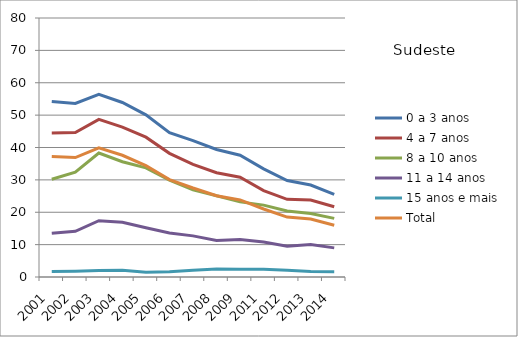
| Category | 0 a 3 anos | 4 a 7 anos | 8 a 10 anos | 11 a 14 anos | 15 anos e mais | Total |
|---|---|---|---|---|---|---|
| 2001.0 | 54.2 | 44.5 | 30.2 | 13.5 | 1.7 | 37.2 |
| 2002.0 | 53.6 | 44.6 | 32.4 | 14.1 | 1.8 | 36.9 |
| 2003.0 | 56.4 | 48.7 | 38.3 | 17.4 | 2 | 39.9 |
| 2004.0 | 53.9 | 46.3 | 35.6 | 16.9 | 2.1 | 37.6 |
| 2005.0 | 50.1 | 43.2 | 33.7 | 15.2 | 1.5 | 34.4 |
| 2006.0 | 44.6 | 38.2 | 29.9 | 13.6 | 1.6 | 30.1 |
| 2007.0 | 42.1 | 34.8 | 26.9 | 12.7 | 2.1 | 27.5 |
| 2008.0 | 39.4 | 32.2 | 25.1 | 11.3 | 2.5 | 25.1 |
| 2009.0 | 37.6 | 30.8 | 23.2 | 11.6 | 2.4 | 23.8 |
| 2011.0 | 33.4 | 26.7 | 22.2 | 10.8 | 2.4 | 21 |
| 2012.0 | 29.8 | 24 | 20.4 | 9.5 | 2.1 | 18.5 |
| 2013.0 | 28.4 | 23.8 | 19.6 | 10 | 1.7 | 17.9 |
| 2014.0 | 25.5 | 21.7 | 18.1 | 9 | 1.6 | 16 |